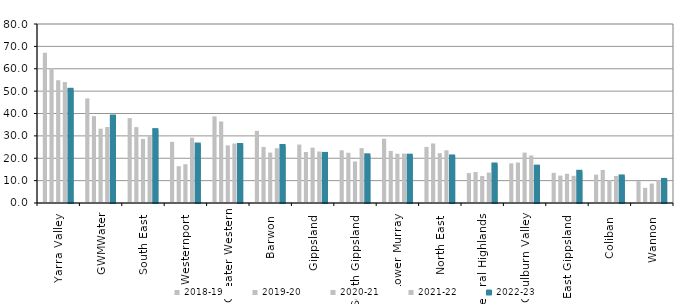
| Category | 2018-19 | 2019-20 | 2020-21 | 2021-22 | 2022-23 |
|---|---|---|---|---|---|
| Yarra Valley  | 67.173 | 60.347 | 54.872 | 54.049 | 50.603 |
| GWMWater | 46.744 | 38.827 | 33.233 | 33.958 | 38.645 |
| South East  | 37.928 | 33.919 | 28.649 | 29.813 | 32.568 |
| Westernport  | 27.35 | 16.424 | 17.327 | 29.202 | 26.122 |
| Greater Western | 38.707 | 36.444 | 25.766 | 26.564 | 25.926 |
| Barwon  | 32.24 | 25.056 | 22.529 | 24.441 | 25.469 |
| Gippsland  | 26.124 | 22.796 | 24.726 | 23.007 | 21.944 |
| South Gippsland  | 23.553 | 22.446 | 18.567 | 24.521 | 21.314 |
| Lower Murray  | 28.731 | 23.265 | 22.018 | 22.111 | 21.158 |
| North East  | 25.076 | 26.605 | 22.277 | 23.561 | 20.792 |
| Central Highlands  | 13.375 | 13.829 | 12.038 | 13.618 | 17.208 |
| Goulburn Valley  | 17.735 | 18.093 | 22.509 | 21.253 | 16.253 |
| East Gippsland  | 13.485 | 12.256 | 13.052 | 12.133 | 13.944 |
| Coliban  | 12.667 | 14.768 | 10.2 | 12.088 | 11.864 |
| Wannon  | 9.765 | 6.768 | 8.694 | 10.314 | 10.316 |